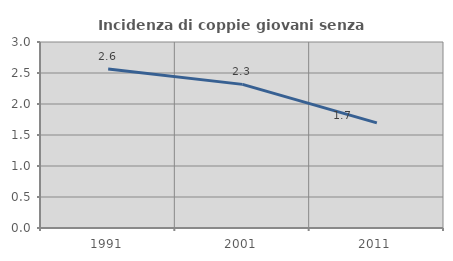
| Category | Incidenza di coppie giovani senza figli |
|---|---|
| 1991.0 | 2.564 |
| 2001.0 | 2.317 |
| 2011.0 | 1.695 |